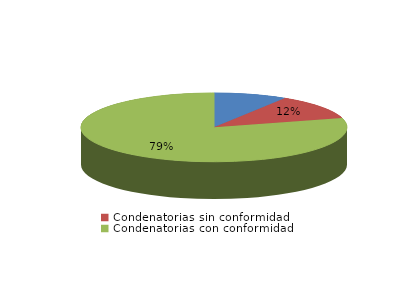
| Category | Series 0 |
|---|---|
| Absolutorias | 13 |
| Condenatorias sin conformidad | 17 |
| Condenatorias con conformidad | 116 |